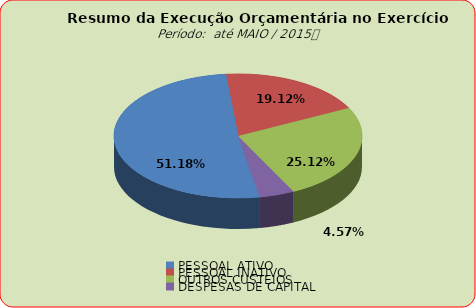
| Category | Series 0 |
|---|---|
| PESSOAL ATIVO | 49053822.61 |
| PESSOAL INATIVO | 18327011.63 |
| OUTROS CUSTEIOS | 24079619.09 |
| DESPESAS DE CAPITAL | 4381558.14 |